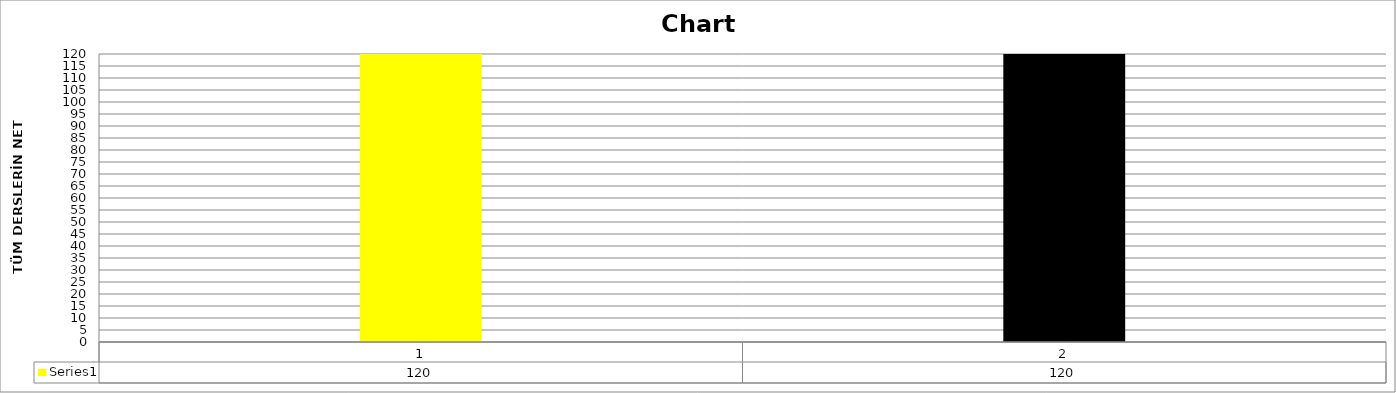
| Category | Series 0 |
|---|---|
| 0 | 120 |
| 1 | 120 |